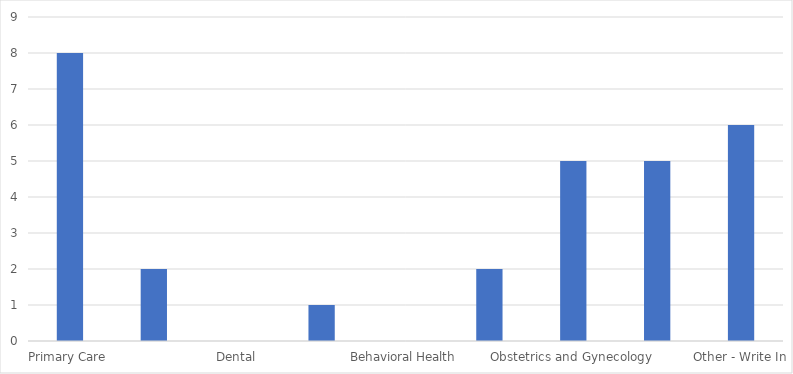
| Category | Number of Responses |
|---|---|
| Primary Care | 8 |
| Pediatrics | 2 |
| Dental | 0 |
| Preventative Medicine | 1 |
| Behavioral Health | 0 |
| Surgery | 2 |
| Obstetrics and Gynecology | 5 |
| Public Health | 5 |
| Other - Write In | 6 |